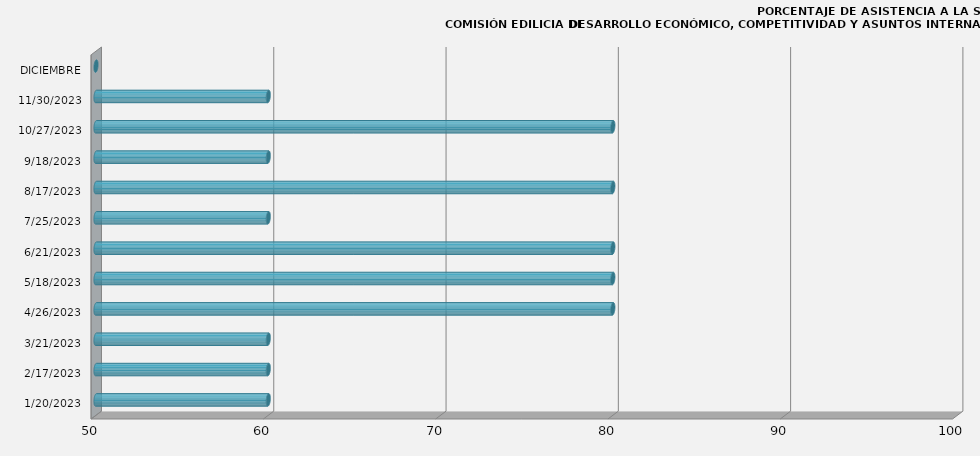
| Category | 20/01/2023 |
|---|---|
| 20/01/2023 | 60 |
| 17/02/2023 | 60 |
| 21/03/2023 | 60 |
| 26/04/2023 | 80 |
| 18/05/2023 | 80 |
| 21/06/2023 | 80 |
| 25/07/2023 | 60 |
| 17/08/2023 | 80 |
| 18/09/2023 | 60 |
| 27/10/2023 | 80 |
| 30/11/2023 | 60 |
| DICIEMBRE | 0 |